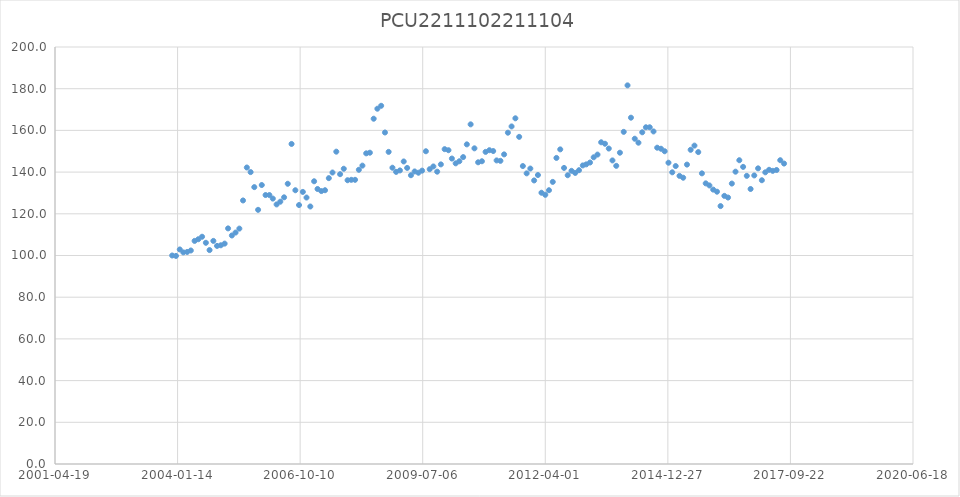
| Category | PCU2211102211104 |
|---|---|
| 37956.0 | 100 |
| 37987.0 | 99.8 |
| 38018.0 | 102.9 |
| 38047.0 | 101.5 |
| 38078.0 | 101.7 |
| 38108.0 | 102.4 |
| 38139.0 | 107 |
| 38169.0 | 107.8 |
| 38200.0 | 109 |
| 38231.0 | 106.1 |
| 38261.0 | 102.6 |
| 38292.0 | 107 |
| 38322.0 | 104.6 |
| 38353.0 | 104.9 |
| 38384.0 | 105.7 |
| 38412.0 | 113 |
| 38443.0 | 109.6 |
| 38473.0 | 111 |
| 38504.0 | 112.9 |
| 38534.0 | 126.4 |
| 38565.0 | 142.2 |
| 38596.0 | 140 |
| 38626.0 | 132.8 |
| 38657.0 | 121.9 |
| 38687.0 | 133.8 |
| 38718.0 | 129 |
| 38749.0 | 129 |
| 38777.0 | 127.3 |
| 38808.0 | 124.5 |
| 38838.0 | 125.8 |
| 38869.0 | 127.9 |
| 38899.0 | 134.4 |
| 38930.0 | 153.5 |
| 38961.0 | 131.3 |
| 38991.0 | 124.2 |
| 39022.0 | 130.5 |
| 39052.0 | 127.8 |
| 39083.0 | 123.5 |
| 39114.0 | 135.6 |
| 39142.0 | 131.9 |
| 39173.0 | 130.9 |
| 39203.0 | 131.3 |
| 39234.0 | 137.1 |
| 39264.0 | 139.8 |
| 39295.0 | 149.8 |
| 39326.0 | 139 |
| 39356.0 | 141.6 |
| 39387.0 | 136.1 |
| 39417.0 | 136.3 |
| 39448.0 | 136.3 |
| 39479.0 | 141.1 |
| 39508.0 | 143.1 |
| 39539.0 | 149 |
| 39569.0 | 149.3 |
| 39600.0 | 165.6 |
| 39630.0 | 170.4 |
| 39661.0 | 171.8 |
| 39692.0 | 159 |
| 39722.0 | 149.7 |
| 39753.0 | 142.1 |
| 39783.0 | 140.1 |
| 39814.0 | 140.8 |
| 39845.0 | 145.1 |
| 39873.0 | 142 |
| 39904.0 | 138.5 |
| 39934.0 | 140.3 |
| 39965.0 | 139.7 |
| 39995.0 | 140.7 |
| 40026.0 | 150 |
| 40057.0 | 141.4 |
| 40087.0 | 142.7 |
| 40118.0 | 140.2 |
| 40148.0 | 143.7 |
| 40179.0 | 151 |
| 40210.0 | 150.5 |
| 40238.0 | 146.5 |
| 40269.0 | 144.2 |
| 40299.0 | 145.2 |
| 40330.0 | 147.2 |
| 40360.0 | 153.3 |
| 40391.0 | 162.9 |
| 40422.0 | 151.4 |
| 40452.0 | 144.7 |
| 40483.0 | 145.2 |
| 40513.0 | 149.7 |
| 40544.0 | 150.5 |
| 40575.0 | 150.1 |
| 40603.0 | 145.6 |
| 40634.0 | 145.4 |
| 40664.0 | 148.5 |
| 40695.0 | 158.9 |
| 40725.0 | 161.9 |
| 40756.0 | 165.8 |
| 40787.0 | 156.9 |
| 40817.0 | 142.9 |
| 40848.0 | 139.4 |
| 40878.0 | 141.7 |
| 40909.0 | 136 |
| 40940.0 | 138.6 |
| 40969.0 | 130.1 |
| 41000.0 | 129.1 |
| 41030.0 | 131.3 |
| 41061.0 | 135.3 |
| 41091.0 | 146.8 |
| 41122.0 | 150.9 |
| 41153.0 | 142 |
| 41183.0 | 138.5 |
| 41214.0 | 140.6 |
| 41244.0 | 139.6 |
| 41275.0 | 140.9 |
| 41306.0 | 143.2 |
| 41334.0 | 143.7 |
| 41365.0 | 144.6 |
| 41395.0 | 147.1 |
| 41426.0 | 148.4 |
| 41456.0 | 154.3 |
| 41487.0 | 153.6 |
| 41518.0 | 151.3 |
| 41548.0 | 145.6 |
| 41579.0 | 143 |
| 41609.0 | 149.3 |
| 41640.0 | 159.3 |
| 41671.0 | 181.6 |
| 41699.0 | 166.1 |
| 41730.0 | 156 |
| 41760.0 | 154.1 |
| 41791.0 | 159.1 |
| 41821.0 | 161.5 |
| 41852.0 | 161.5 |
| 41883.0 | 159.5 |
| 41913.0 | 151.7 |
| 41944.0 | 151.2 |
| 41974.0 | 150 |
| 42005.0 | 144.5 |
| 42036.0 | 139.9 |
| 42064.0 | 142.9 |
| 42095.0 | 138.2 |
| 42125.0 | 137.3 |
| 42156.0 | 143.6 |
| 42186.0 | 150.7 |
| 42217.0 | 152.7 |
| 42248.0 | 149.6 |
| 42278.0 | 139.4 |
| 42309.0 | 134.6 |
| 42339.0 | 133.6 |
| 42370.0 | 131.6 |
| 42401.0 | 130.6 |
| 42430.0 | 123.7 |
| 42461.0 | 128.6 |
| 42491.0 | 127.8 |
| 42522.0 | 134.5 |
| 42552.0 | 140.2 |
| 42583.0 | 145.7 |
| 42614.0 | 142.5 |
| 42644.0 | 138.2 |
| 42675.0 | 131.9 |
| 42705.0 | 138.4 |
| 42736.0 | 141.8 |
| 42767.0 | 136.1 |
| 42795.0 | 139.9 |
| 42826.0 | 141.1 |
| 42856.0 | 140.6 |
| 42887.0 | 141 |
| 42917.0 | 145.7 |
| 42948.0 | 144.1 |